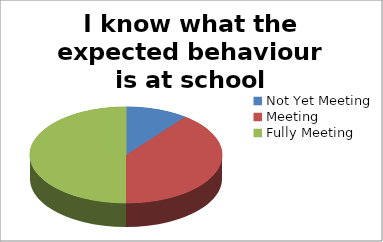
| Category | I know what the expected behaviour is at school |
|---|---|
| Not Yet Meeting | 4 |
| Meeting | 15 |
| Fully Meeting | 19 |